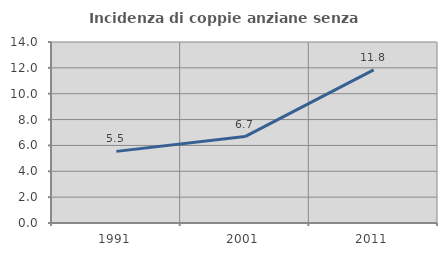
| Category | Incidenza di coppie anziane senza figli  |
|---|---|
| 1991.0 | 5.54 |
| 2001.0 | 6.687 |
| 2011.0 | 11.841 |